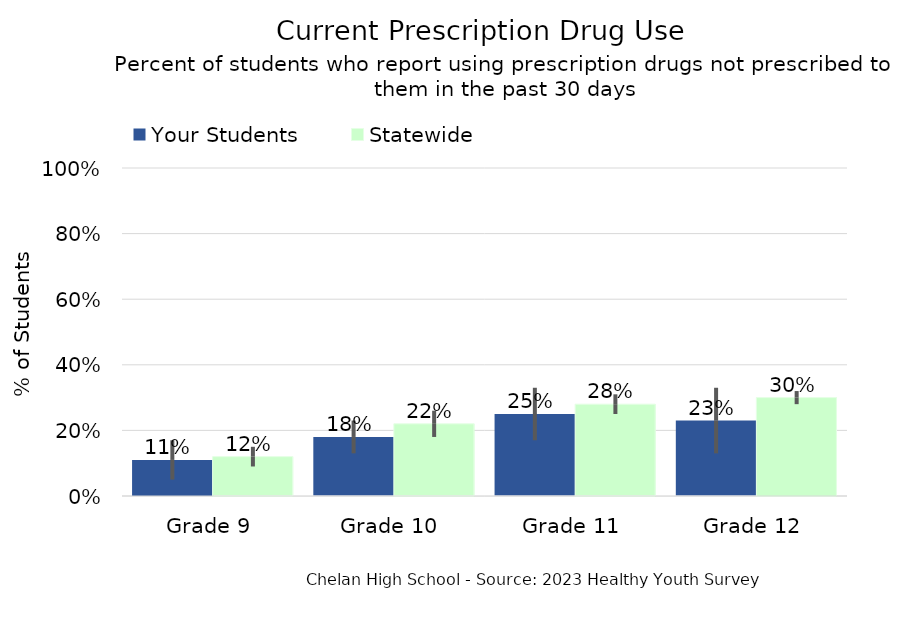
| Category | Your Students | Statewide |
|---|---|---|
| Grade 9 | 0.11 | 0.12 |
| Grade 10 | 0.18 | 0.22 |
| Grade 11 | 0.25 | 0.28 |
| Grade 12 | 0.23 | 0.3 |